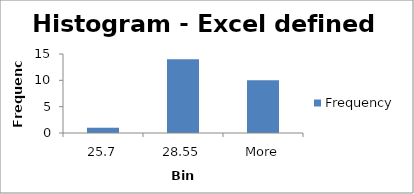
| Category | Frequency |
|---|---|
| 25.7 | 1 |
| 28.55 | 14 |
| More | 10 |